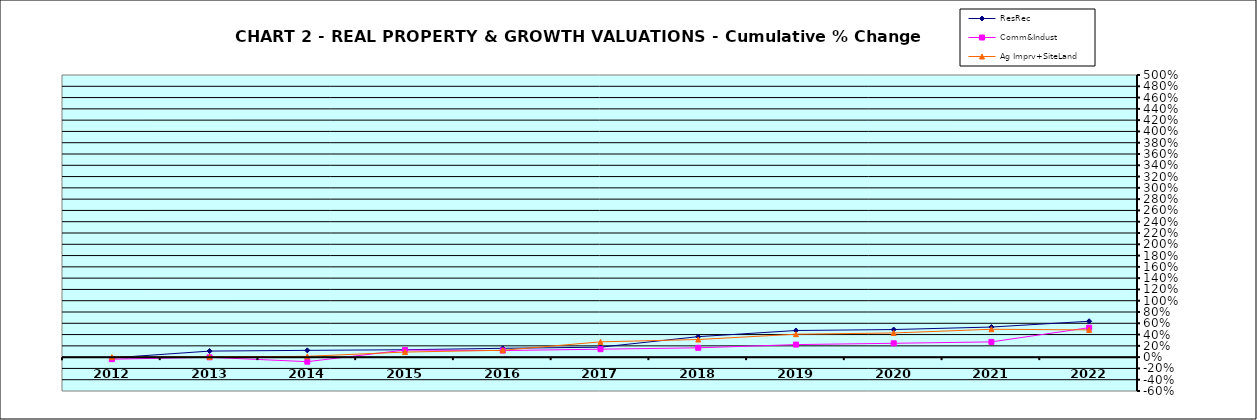
| Category | ResRec | Comm&Indust | Ag Imprv+SiteLand |
|---|---|---|---|
| 2012.0 | -0.013 | -0.036 | 0 |
| 2013.0 | 0.107 | -0.003 | 0.006 |
| 2014.0 | 0.12 | -0.08 | 0.014 |
| 2015.0 | 0.131 | 0.126 | 0.091 |
| 2016.0 | 0.157 | 0.117 | 0.121 |
| 2017.0 | 0.177 | 0.141 | 0.271 |
| 2018.0 | 0.363 | 0.166 | 0.313 |
| 2019.0 | 0.472 | 0.222 | 0.406 |
| 2020.0 | 0.489 | 0.245 | 0.428 |
| 2021.0 | 0.533 | 0.27 | 0.494 |
| 2022.0 | 0.636 | 0.522 | 0.483 |